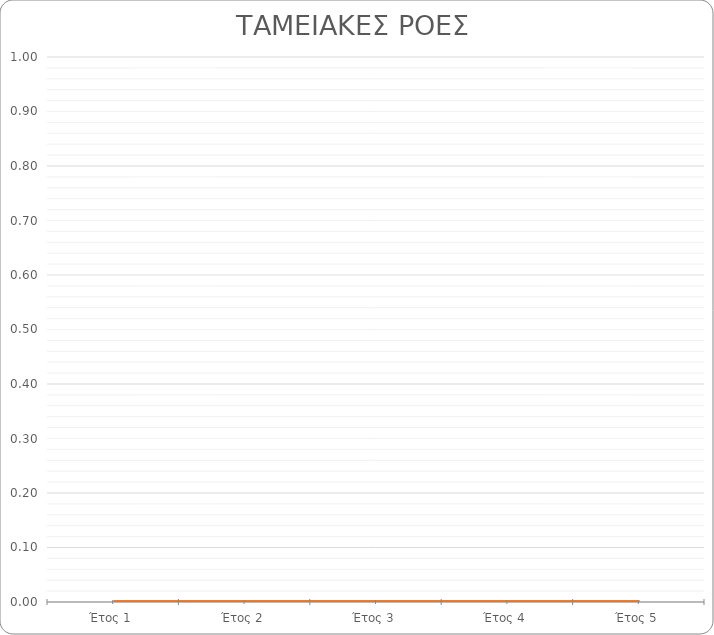
| Category | Series 0 | Series 1 | Series 2 |
|---|---|---|---|
| Έτος 1 | 0 | 0 | 0 |
| Έτος 2 | 0 | 0 | 0 |
| Έτος 3 | 0 | 0 | 0 |
| Έτος 4 | 0 | 0 | 0 |
| Έτος 5 | 0 | 0 | 0 |